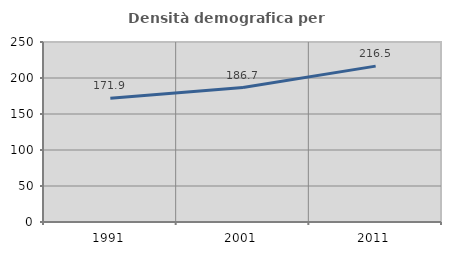
| Category | Densità demografica |
|---|---|
| 1991.0 | 171.944 |
| 2001.0 | 186.696 |
| 2011.0 | 216.493 |